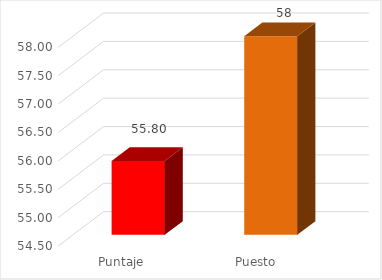
| Category | Series 0 |
|---|---|
| Puntaje  | 55.8 |
| Puesto | 58 |